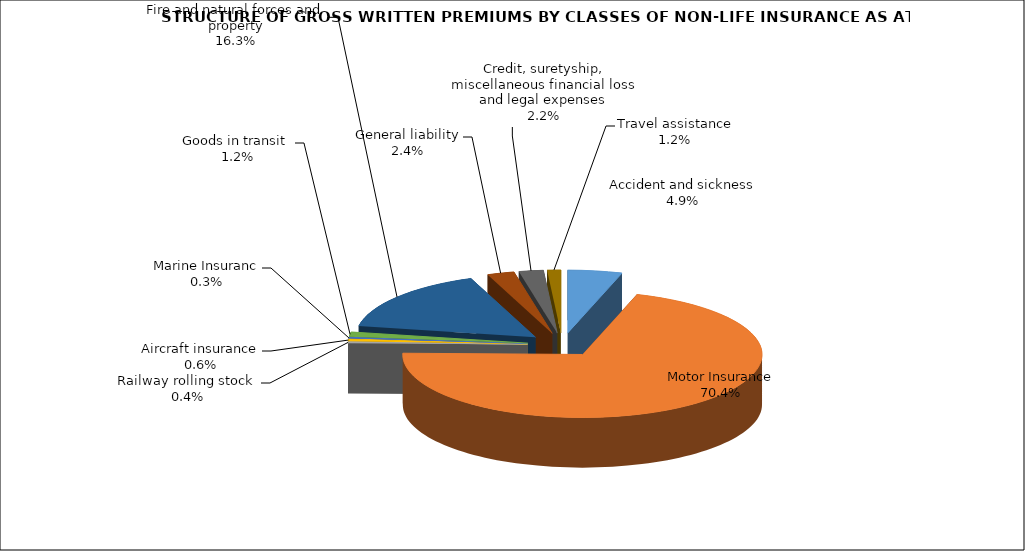
| Category | Accident and sickness |
|---|---|
| Accident and sickness | 0.049 |
| Motor Insurance | 0.704 |
| Railway rolling stock  | 0.004 |
| Aircraft insurance | 0.006 |
| Marine Insuranc | 0.003 |
| Goods in transit  | 0.012 |
| Fire and natural forces and property | 0.163 |
| General liability | 0.024 |
| Credit, suretyship, miscellaneous financial loss and legal expenses | 0.022 |
| Travel assistance | 0.012 |